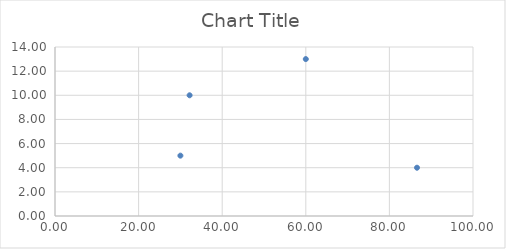
| Category | Series 0 |
|---|---|
| 86.602 | 4 |
| 32.2 | 10 |
| 60.0 | 13 |
| 30.0 | 5 |